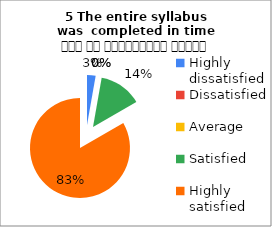
| Category | 5 The entire syllabus was  completed in time समय पर पाठ्यक्रम पूर्ण हुआ |
|---|---|
| Highly dissatisfied | 1 |
| Dissatisfied | 0 |
| Average | 0 |
| Satisfied | 5 |
| Highly satisfied | 30 |